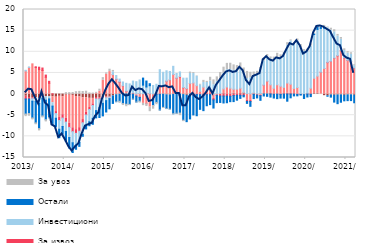
| Category | По трансакционим рачунима | За ликвидност и обртна средства  | За извоз | Инвестициони | Остали | За увоз |
|---|---|---|---|---|---|---|
| 2013-01-01 | -0.509 | 5.466 | -0.655 | 0.157 | -3.557 | -0.62 |
| 2013-02-01 | -0.821 | 6.307 | -0.351 | 0.101 | -3.442 | -0.636 |
| 2013-03-01 | -0.908 | 7.144 | -0.174 | -0.604 | -3.955 | -0.473 |
| 2013-04-01 | -0.906 | 6.265 | 0.188 | -0.805 | -5.11 | -0.441 |
| 2013-05-01 | -1.028 | 5.791 | 0.566 | -1.205 | -5.942 | -0.539 |
| 2013-06-01 | -0.715 | 5.566 | 0.59 | -0.246 | -4.209 | -0.467 |
| 2013-07-01 | -0.656 | 3.962 | 0.527 | -0.788 | -4.619 | -0.522 |
| 2013-08-01 | -0.571 | 2.543 | 0.475 | -0.574 | -4.455 | -0.211 |
| 2013-09-01 | -0.597 | -1.463 | 0.046 | -0.788 | -4.325 | -0.17 |
| 2013-10-01 | -0.731 | -3.405 | -0.479 | -1.101 | -1.998 | -0.034 |
| 2013-11-01 | -0.534 | -5.012 | -0.697 | -2.071 | -1.999 | 0.032 |
| 2013-12-01 | -0.631 | -4.25 | -0.793 | -2 | -1.812 | 0.042 |
| 2014-01-01 | -0.248 | -5.468 | -0.921 | -2.223 | -2.314 | 0.338 |
| 2014-02-01 | -0.244 | -6.677 | -0.967 | -2.397 | -2.478 | 0.345 |
| 2014-03-01 | -0.312 | -7.664 | -0.914 | -2.634 | -2.299 | 0.368 |
| 2014-04-01 | -0.598 | -7.82 | -0.878 | -2.779 | -0.977 | 0.561 |
| 2014-05-01 | -0.678 | -7.271 | -0.835 | -2.63 | -0.953 | 0.634 |
| 2014-06-01 | -0.89 | -5.133 | -0.763 | -2.735 | -0.458 | 0.61 |
| 2014-07-01 | -0.861 | -3.427 | -0.672 | -2.518 | -0.758 | 0.681 |
| 2014-08-01 | -1.004 | -2.174 | -0.467 | -2.918 | -0.917 | 0.276 |
| 2014-09-01 | -1.021 | -1.308 | -0.375 | -3.018 | -1.426 | 0.243 |
| 2014-10-01 | -0.819 | 0.161 | -0.34 | -2.752 | -1.718 | 0.247 |
| 2014-11-01 | -0.858 | 0.695 | -0.279 | -2.093 | -2.317 | 0.459 |
| 2014-12-01 | -0.577 | 3.263 | -0.264 | -1.35 | -2.967 | 0.625 |
| 2015-01-01 | -0.712 | 4.673 | -0.142 | -0.704 | -2.68 | 0.34 |
| 2015-02-01 | -0.565 | 5.321 | -0.111 | -0.407 | -2.409 | 0.553 |
| 2015-03-01 | -0.434 | 4.59 | 0.008 | 0.669 | -1.773 | 0.324 |
| 2015-04-01 | -0.175 | 3.498 | 0.044 | 0.845 | -1.638 | -0.132 |
| 2015-05-01 | -0.054 | 2.82 | 0.068 | 0.654 | -1.651 | -0.488 |
| 2015-06-01 | 0.05 | 1.84 | 0.063 | 0.904 | -2.258 | -0.459 |
| 2015-07-01 | 0.129 | 0.502 | 0.07 | 1.849 | -2.403 | -0.592 |
| 2015-08-01 | 0.104 | 0.009 | -0.067 | 2.291 | -2.376 | -0.307 |
| 2015-09-01 | 0.112 | 0.208 | -0.055 | 2.751 | -1.148 | -0.214 |
| 2015-10-01 | 0.038 | -0.411 | -0.06 | 2.883 | -1.421 | -0.215 |
| 2015-11-01 | 0.131 | -0.703 | -0.076 | 3.2 | -0.895 | -0.44 |
| 2015-12-01 | 0.06 | -2.198 | 0.008 | 2.045 | 1.664 | -0.542 |
| 2016-01-01 | 0.112 | -2.269 | -0.03 | 1.566 | 1.404 | -0.65 |
| 2016-02-01 | 0.086 | -3.097 | 0.005 | 1.894 | 0.462 | -1.069 |
| 2016-03-01 | 0.054 | -1.187 | -0.022 | 1.97 | -1.494 | -0.878 |
| 2016-04-01 | 0.002 | 0.259 | -0.024 | 2.055 | -1.952 | -0.542 |
| 2016-05-01 | -0.049 | 2.232 | -0.014 | 3.525 | -3.719 | -0.201 |
| 2016-06-01 | -0.049 | 2.038 | 0.004 | 3.11 | -3.101 | -0.262 |
| 2016-07-01 | -0.188 | 3.046 | 0.004 | 2.456 | -3.237 | -0.159 |
| 2016-08-01 | -0.222 | 3.353 | 0.003 | 1.994 | -3.361 | -0.259 |
| 2016-09-01 | -0.107 | 4.637 | 0.003 | 1.923 | -4.549 | -0.209 |
| 2016-10-01 | -0.069 | 3.752 | 0.02 | 1.099 | -4.471 | -0.197 |
| 2016-11-01 | 0.003 | 4.032 | 0.118 | 1.076 | -4.499 | -0.6 |
| 2016-12-01 | -0.126 | 1.493 | 0.07 | 2.199 | -6.059 | -0.332 |
| 2017-01-01 | -0.287 | 1.255 | 0.034 | 2.468 | -6.239 | 0.016 |
| 2017-02-01 | -0.028 | 2.502 | 0.033 | 2.337 | -5.845 | 0.328 |
| 2017-03-01 | -0.212 | 2.639 | -0.061 | 2.218 | -4.66 | 0.242 |
| 2017-04-01 | 0.006 | 1.986 | -0.118 | 2.178 | -5.005 | 0.123 |
| 2017-05-01 | -0.021 | 0.622 | -0.131 | 1.488 | -3.457 | 0.202 |
| 2017-06-01 | -0.058 | 1.637 | -0.146 | 1.1 | -3.715 | 0.504 |
| 2017-07-01 | 0.066 | 0.742 | -0.146 | 1.936 | -2.615 | 0.257 |
| 2017-08-01 | 0.095 | 1.091 | -0.147 | 1.891 | -2.348 | 0.891 |
| 2017-09-01 | -0.033 | -1.003 | -0.338 | 2.229 | -1.931 | 1.128 |
| 2017-10-01 | 0.035 | -0.002 | -0.349 | 2.95 | -1.675 | 1.076 |
| 2017-11-01 | -0.038 | 0.191 | -0.423 | 3.298 | -1.519 | 1.614 |
| 2017-12-01 | 0.111 | 1.115 | -0.472 | 3.68 | -1.636 | 1.452 |
| 2018-01-01 | -0.017 | 1.678 | -0.449 | 4.093 | -1.582 | 1.485 |
| 2018-02-01 | -0.076 | 1.395 | -0.446 | 4.432 | -1.275 | 1.464 |
| 2018-03-01 | 0.181 | 0.968 | -0.353 | 4.465 | -1.426 | 1.286 |
| 2018-04-01 | 0.071 | 1.103 | -0.297 | 4.181 | -1.141 | 1.381 |
| 2018-05-01 | 0.137 | 1.251 | -0.296 | 4.4 | -0.726 | 1.574 |
| 2018-06-01 | 0.284 | 0.134 | -0.277 | 4.559 | -0.377 | 1.191 |
| 2018-07-01 | 0.145 | -1.444 | -0.282 | 3.523 | -0.476 | 1.691 |
| 2018-08-01 | 0.047 | -1.482 | -0.277 | 3.826 | -1.138 | 1.281 |
| 2018-09-01 | 0.187 | 0.07 | -0.088 | 3.999 | -0.981 | 0.962 |
| 2018-10-01 | 0.165 | -0.154 | -0.086 | 4.312 | -0.67 | 0.902 |
| 2018-11-01 | 0.151 | -0.294 | -0.083 | 5.778 | -1.1 | 0.383 |
| 2018-12-01 | 0.121 | 2.002 | 0.005 | 5.72 | -0.449 | 0.69 |
| 2019-01-01 | 0.084 | 2.964 | 0.003 | 5.799 | -0.532 | 0.511 |
| 2019-02-01 | 0.122 | 2.071 | -0.001 | 6.112 | -0.71 | 0.483 |
| 2019-03-01 | -0.043 | 1.384 | -0.007 | 6.432 | -0.89 | 0.926 |
| 2019-04-01 | -0.017 | 2.209 | -0.007 | 6.458 | -1.061 | 0.975 |
| 2019-05-01 | -0.065 | 1.864 | -0.007 | 6.82 | -0.881 | 0.597 |
| 2019-06-01 | 0.071 | 1.52 | -0.011 | 7.649 | -0.954 | 0.599 |
| 2019-07-01 | 0.174 | 2.439 | -0.011 | 8.965 | -1.672 | 0.577 |
| 2019-08-01 | 0.114 | 2.222 | -0.011 | 10.233 | -0.877 | 0.238 |
| 2019-09-01 | 0.013 | 1.329 | -0.011 | 10.479 | -0.423 | 0.206 |
| 2019-10-31 | -0.066 | 1.541 | -0.01 | 11.047 | -0.342 | 0.436 |
| 2019-11-30 | -0.091 | 0.084 | -0.01 | 10.759 | -0.137 | 0.843 |
| 2019-12-31 | -0.112 | -0.022 | -0.01 | 10.098 | -0.896 | 0.408 |
| 2020-01-31 | 0.054 | 0.141 | -0.01 | 9.923 | -0.677 | 0.532 |
| 2020-02-29 | -0.038 | 1.384 | -0.005 | 9.987 | -0.557 | 0.483 |
| 2020-03-31 | 0.142 | 3.609 | 0 | 10.341 | 0.142 | 0.224 |
| 2020-04-30 | 0.16 | 4.087 | 0 | 11.041 | 0.559 | 0.149 |
| 2020-05-31 | -0.034 | 5.187 | 0.005 | 10.338 | 0.308 | 0.306 |
| 2020-06-30 | -0.38 | 6.042 | 0.022 | 9.534 | 0.223 | 0.414 |
| 2020-07-31 | -0.388 | 7.439 | 0.076 | 8.138 | -0.127 | 0.2 |
| 2020-08-31 | -0.211 | 7.694 | 0.075 | 7.348 | -0.512 | 0.459 |
| 2020-09-30 | -0.276 | 8.456 | 0.072 | 6.174 | -1.624 | 0.508 |
| 2020-10-31 | -0.209 | 9.015 | 0.061 | 4.618 | -2.062 | 0.415 |
| 2020-11-30 | -0.198 | 10.255 | 0.062 | 2.65 | -1.729 | 0.415 |
| 2020-12-31 | -0.289 | 8.536 | 0.053 | 1.68 | -1.31 | 0.431 |
| 2021-01-31 | -0.187 | 7.94 | 0.055 | 1.703 | -1.365 | 0.346 |
| 2021-02-28 | -0.182 | 7.661 | 0.056 | 1.682 | -1.362 | 0.377 |
| 2021-03-31 | -0.281 | 6.083 | 0.055 | 0.556 | -1.747 | 0.244 |